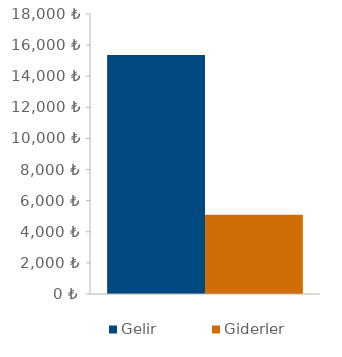
| Category | Gelir | Giderler |
|---|---|---|
| 0 | 15360 | 5100 |